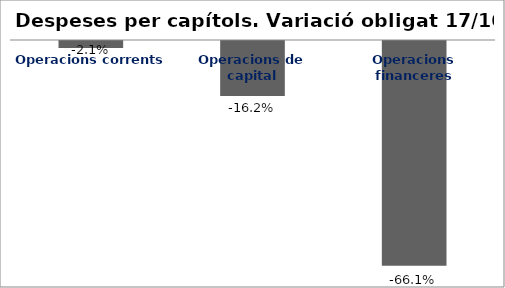
| Category | Series 0 |
|---|---|
| Operacions corrents | -0.021 |
| Operacions de capital | -0.162 |
| Operacions financeres | -0.661 |